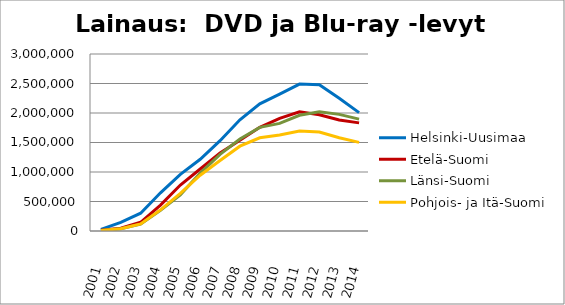
| Category | Helsinki-Uusimaa | Etelä-Suomi | Länsi-Suomi | Pohjois- ja Itä-Suomi |
|---|---|---|---|---|
| 2001.0 | 28747 | 13976 | 8034 | 8688 |
| 2002.0 | 145226 | 48271 | 38781 | 38205 |
| 2003.0 | 301956 | 148071 | 116155 | 120303 |
| 2004.0 | 647655 | 440081 | 350679 | 357364 |
| 2005.0 | 958778 | 779573 | 612134 | 637601 |
| 2006.0 | 1215361 | 1051088 | 981393 | 945254 |
| 2007.0 | 1530728 | 1320894 | 1299201 | 1195365 |
| 2008.0 | 1885736 | 1538302 | 1559106 | 1437928 |
| 2009.0 | 2156261 | 1758232 | 1756931 | 1579212 |
| 2010.0 | 2318885 | 1910290 | 1823965 | 1627512 |
| 2011.0 | 2489504 | 2019743 | 1961416 | 1694798 |
| 2012.0 | 2478307 | 1970877 | 2020920 | 1677024 |
| 2013.0 | 2249731 | 1882726 | 1976659 | 1579659 |
| 2014.0 | 2006037 | 1832507 | 1896467 | 1502484 |